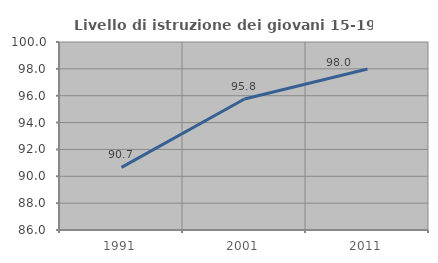
| Category | Livello di istruzione dei giovani 15-19 anni |
|---|---|
| 1991.0 | 90.667 |
| 2001.0 | 95.758 |
| 2011.0 | 97.987 |